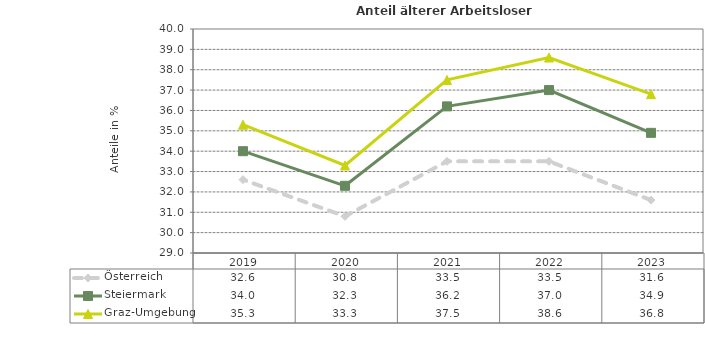
| Category | Österreich | Steiermark | Graz-Umgebung |
|---|---|---|---|
| 2023.0 | 31.6 | 34.9 | 36.8 |
| 2022.0 | 33.5 | 37 | 38.6 |
| 2021.0 | 33.5 | 36.2 | 37.5 |
| 2020.0 | 30.8 | 32.3 | 33.3 |
| 2019.0 | 32.6 | 34 | 35.3 |